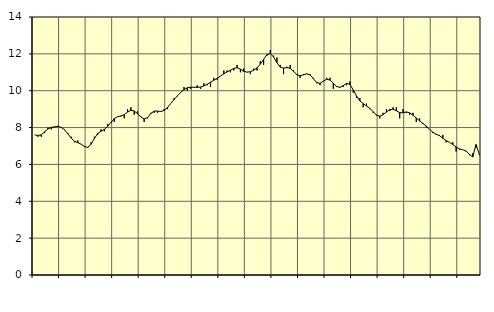
| Category | Piggar | Series 1 |
|---|---|---|
| nan | 7.6 | 7.6 |
| 87.0 | 7.5 | 7.57 |
| 87.0 | 7.5 | 7.61 |
| 87.0 | 7.7 | 7.77 |
| nan | 8 | 7.93 |
| 88.0 | 7.9 | 8.01 |
| 88.0 | 8 | 8.04 |
| 88.0 | 8.1 | 8.06 |
| nan | 8 | 8.01 |
| 89.0 | 7.9 | 7.88 |
| 89.0 | 7.7 | 7.66 |
| 89.0 | 7.5 | 7.43 |
| nan | 7.2 | 7.26 |
| 90.0 | 7.3 | 7.18 |
| 90.0 | 7.1 | 7.1 |
| 90.0 | 7 | 6.97 |
| nan | 6.9 | 6.93 |
| 91.0 | 7.2 | 7.09 |
| 91.0 | 7.5 | 7.41 |
| 91.0 | 7.6 | 7.68 |
| nan | 7.9 | 7.8 |
| 92.0 | 7.8 | 7.9 |
| 92.0 | 8.2 | 8.07 |
| 92.0 | 8.3 | 8.28 |
| nan | 8.3 | 8.49 |
| 93.0 | 8.6 | 8.59 |
| 93.0 | 8.6 | 8.63 |
| 93.0 | 8.5 | 8.7 |
| nan | 9 | 8.84 |
| 94.0 | 9.1 | 8.94 |
| 94.0 | 8.7 | 8.9 |
| 94.0 | 8.9 | 8.75 |
| nan | 8.6 | 8.58 |
| 95.0 | 8.3 | 8.47 |
| 95.0 | 8.5 | 8.54 |
| 95.0 | 8.8 | 8.76 |
| nan | 8.8 | 8.89 |
| 96.0 | 8.8 | 8.9 |
| 96.0 | 8.9 | 8.87 |
| 96.0 | 9 | 8.93 |
| nan | 9 | 9.08 |
| 97.0 | 9.3 | 9.3 |
| 97.0 | 9.6 | 9.52 |
| 97.0 | 9.7 | 9.72 |
| nan | 9.9 | 9.91 |
| 98.0 | 10.2 | 10.06 |
| 98.0 | 10 | 10.16 |
| 98.0 | 10.1 | 10.19 |
| nan | 10.2 | 10.19 |
| 99.0 | 10.3 | 10.18 |
| 99.0 | 10.1 | 10.2 |
| 99.0 | 10.4 | 10.26 |
| nan | 10.3 | 10.35 |
| 0.0 | 10.2 | 10.46 |
| 0.0 | 10.7 | 10.57 |
| 0.0 | 10.6 | 10.67 |
| nan | 10.8 | 10.79 |
| 1.0 | 11.1 | 10.92 |
| 1.0 | 11.1 | 11.02 |
| 1.0 | 11 | 11.11 |
| nan | 11.1 | 11.21 |
| 2.0 | 11.4 | 11.25 |
| 2.0 | 11 | 11.17 |
| 2.0 | 11.2 | 11.05 |
| nan | 11 | 11.01 |
| 3.0 | 10.9 | 11.03 |
| 3.0 | 11.2 | 11.11 |
| 3.0 | 11.1 | 11.24 |
| nan | 11.6 | 11.44 |
| 4.0 | 11.4 | 11.7 |
| 4.0 | 11.9 | 11.96 |
| 4.0 | 12.2 | 12.02 |
| nan | 11.9 | 11.83 |
| 5.0 | 11.8 | 11.52 |
| 5.0 | 11.4 | 11.28 |
| 5.0 | 10.9 | 11.23 |
| nan | 11.3 | 11.25 |
| 6.0 | 11.4 | 11.22 |
| 6.0 | 11.1 | 11.06 |
| 6.0 | 10.9 | 10.87 |
| nan | 10.7 | 10.81 |
| 7.0 | 10.9 | 10.86 |
| 7.0 | 10.9 | 10.92 |
| 7.0 | 10.9 | 10.86 |
| nan | 10.7 | 10.65 |
| 8.0 | 10.4 | 10.44 |
| 8.0 | 10.3 | 10.4 |
| 8.0 | 10.5 | 10.52 |
| nan | 10.7 | 10.62 |
| 9.0 | 10.7 | 10.58 |
| 9.0 | 10.1 | 10.41 |
| 9.0 | 10.2 | 10.23 |
| nan | 10.2 | 10.18 |
| 10.0 | 10.2 | 10.28 |
| 10.0 | 10.3 | 10.4 |
| 10.0 | 10.5 | 10.34 |
| nan | 9.9 | 10.05 |
| 11.0 | 9.6 | 9.71 |
| 11.0 | 9.6 | 9.45 |
| 11.0 | 9.1 | 9.3 |
| nan | 9.3 | 9.17 |
| 12.0 | 9 | 9.04 |
| 12.0 | 8.8 | 8.86 |
| 12.0 | 8.7 | 8.67 |
| nan | 8.5 | 8.62 |
| 13.0 | 8.8 | 8.7 |
| 13.0 | 9 | 8.84 |
| 13.0 | 8.9 | 8.98 |
| nan | 9.1 | 9 |
| 14.0 | 9.1 | 8.91 |
| 14.0 | 8.5 | 8.81 |
| 14.0 | 9 | 8.8 |
| nan | 8.8 | 8.85 |
| 15.0 | 8.7 | 8.8 |
| 15.0 | 8.8 | 8.67 |
| 15.0 | 8.3 | 8.52 |
| nan | 8.5 | 8.36 |
| 16.0 | 8.2 | 8.23 |
| 16.0 | 8 | 8.08 |
| 16.0 | 7.9 | 7.9 |
| nan | 7.7 | 7.75 |
| 17.0 | 7.6 | 7.64 |
| 17.0 | 7.6 | 7.56 |
| 17.0 | 7.6 | 7.42 |
| nan | 7.2 | 7.29 |
| 18.0 | 7.2 | 7.2 |
| 18.0 | 7.2 | 7.08 |
| 18.0 | 6.7 | 6.95 |
| nan | 6.8 | 6.84 |
| 19.0 | 6.8 | 6.8 |
| 19.0 | 6.7 | 6.73 |
| 19.0 | 6.5 | 6.55 |
| nan | 6.6 | 6.4 |
| 20.0 | 6.9 | 7.08 |
| 20.0 | 6.5 | 6.55 |